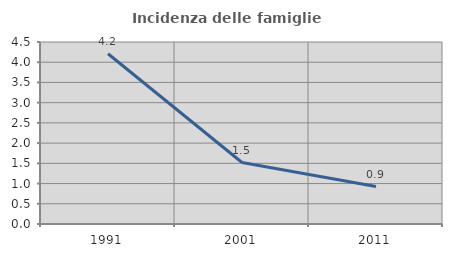
| Category | Incidenza delle famiglie numerose |
|---|---|
| 1991.0 | 4.209 |
| 2001.0 | 1.52 |
| 2011.0 | 0.926 |